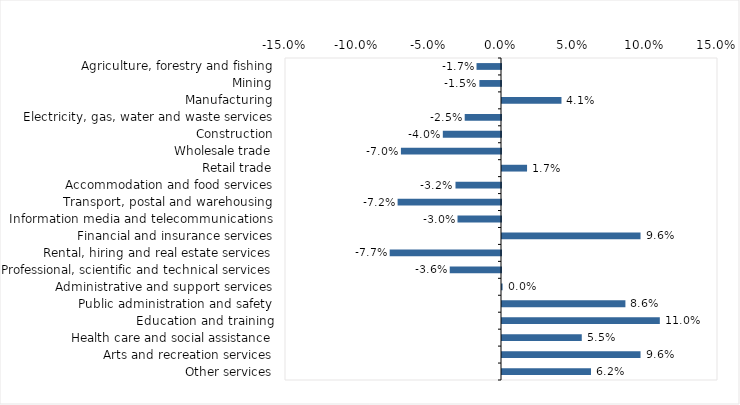
| Category | This week |
|---|---|
| Agriculture, forestry and fishing | -0.017 |
| Mining | -0.015 |
| Manufacturing | 0.041 |
| Electricity, gas, water and waste services | -0.025 |
| Construction | -0.04 |
| Wholesale trade | -0.07 |
| Retail trade | 0.017 |
| Accommodation and food services | -0.032 |
| Transport, postal and warehousing | -0.072 |
| Information media and telecommunications | -0.03 |
| Financial and insurance services | 0.096 |
| Rental, hiring and real estate services | -0.077 |
| Professional, scientific and technical services | -0.036 |
| Administrative and support services | 0 |
| Public administration and safety | 0.086 |
| Education and training | 0.11 |
| Health care and social assistance | 0.055 |
| Arts and recreation services | 0.096 |
| Other services | 0.062 |